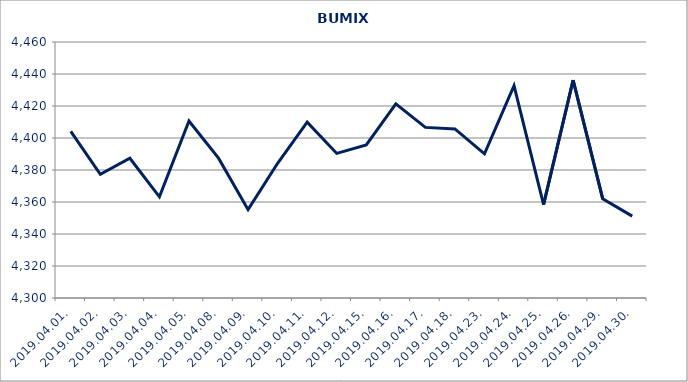
| Category | BUMIX |
|---|---|
| 2019.04.01. | 4404.188 |
| 2019.04.02. | 4377.333 |
| 2019.04.03. | 4387.356 |
| 2019.04.04. | 4363.232 |
| 2019.04.05. | 4410.606 |
| 2019.04.08. | 4387.404 |
| 2019.04.09. | 4355.229 |
| 2019.04.10. | 4384.177 |
| 2019.04.11. | 4409.897 |
| 2019.04.12. | 4390.358 |
| 2019.04.15. | 4395.658 |
| 2019.04.16. | 4421.303 |
| 2019.04.17. | 4406.629 |
| 2019.04.18. | 4405.672 |
| 2019.04.23. | 4390.102 |
| 2019.04.24. | 4432.755 |
| 2019.04.25. | 4358.305 |
| 2019.04.26. | 4436.215 |
| 2019.04.29. | 4362.069 |
| 2019.04.30. | 4351.191 |